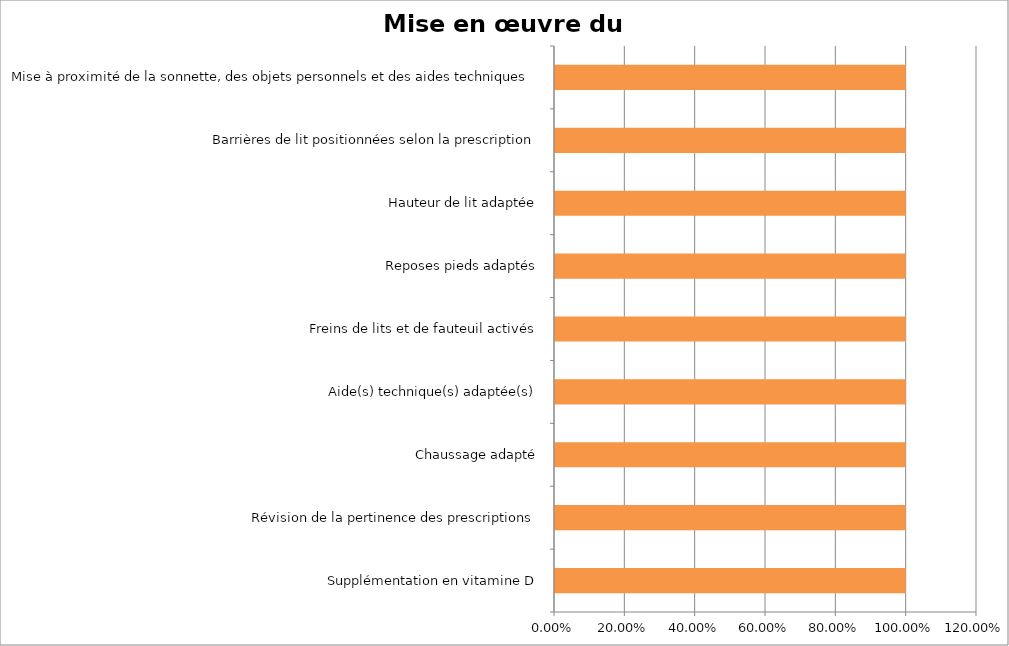
| Category | Series 0 | Series 1 |
|---|---|---|
| Supplémentation en vitamine D | 0 | 1 |
| Révision de la pertinence des prescriptions | 0 | 1 |
| Chaussage adapté | 0 | 1 |
| Aide(s) technique(s) adaptée(s) | 0 | 1 |
| Freins de lits et de fauteuil activés | 0 | 1 |
| Reposes pieds adaptés | 0 | 1 |
| Hauteur de lit adaptée | 0 | 1 |
| Barrières de lit positionnées selon la prescription | 0 | 1 |
| Mise à proximité de la sonnette, des objets personnels et des aides techniques | 0 | 1 |